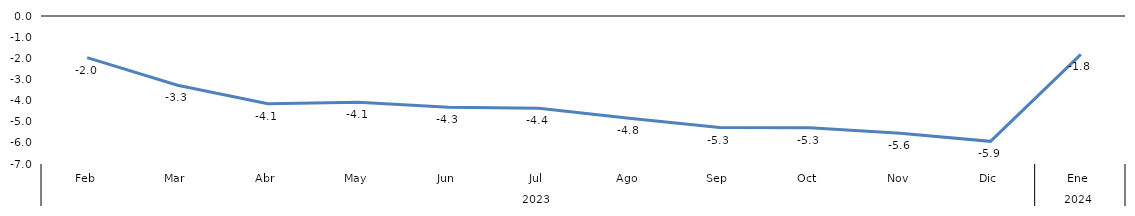
| Category | Bogotá |
|---|---|
| 0 | -1.97 |
| 1 | -3.274 |
| 2 | -4.147 |
| 3 | -4.076 |
| 4 | -4.32 |
| 5 | -4.366 |
| 6 | -4.836 |
| 7 | -5.275 |
| 8 | -5.282 |
| 9 | -5.551 |
| 10 | -5.929 |
| 11 | -1.819 |